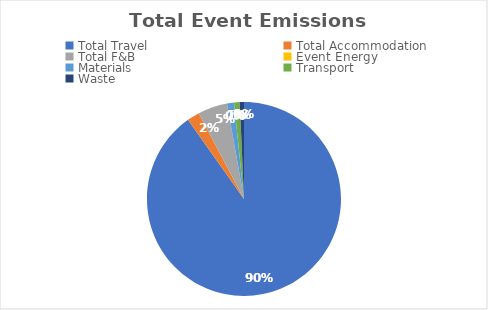
| Category | Series 0 |
|---|---|
| Total Travel | 3.86 |
| Total Accommodation | 0.09 |
| Total F&B | 0.21 |
| Event Energy | 0 |
| Materials | 0.05 |
| Transport | 0.04 |
| Waste | 0.03 |